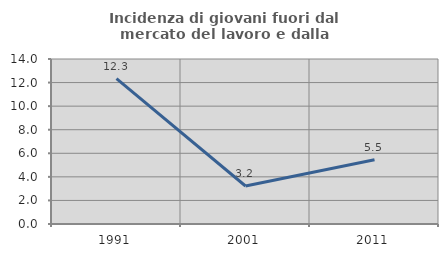
| Category | Incidenza di giovani fuori dal mercato del lavoro e dalla formazione  |
|---|---|
| 1991.0 | 12.329 |
| 2001.0 | 3.226 |
| 2011.0 | 5.455 |